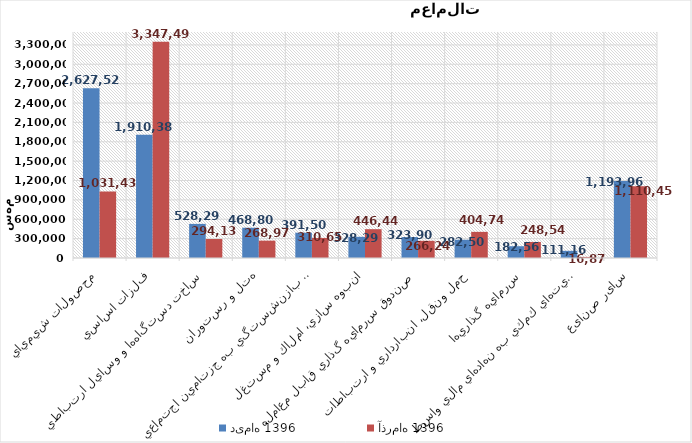
| Category | دی‌ماه 1396 | آذر‌ماه 1396 |
|---|---|---|
| محصولات شيميايي | 2627526.865 | 1031432.563 |
| فلزات اساسي | 1910387.582 | 3347493.853 |
| ساخت دستگاه‌ها و وسايل ارتباطي | 528296.49 | 294130.327 |
| هتل و رستوران | 468805.605 | 268974.9 |
| بيمه وصندوق بازنشستگي به جزتامين اجتماعي | 391499.699 | 310656.478 |
| انبوه سازي، املاك و مستغلات | 328294.715 | 446446.574 |
| صندوق سرمايه گذاري قابل معامله | 323904.522 | 266241.831 |
| حمل ونقل، انبارداري و ارتباطات | 282508.283 | 404742.827 |
| سرمايه گذاريها | 182561.405 | 248542.535 |
| فعاليتهاي كمكي به نهادهاي مالي واسط | 111168.127 | 16876.81 |
| سایر صنایع | 1193963.925 | 1110453.408 |